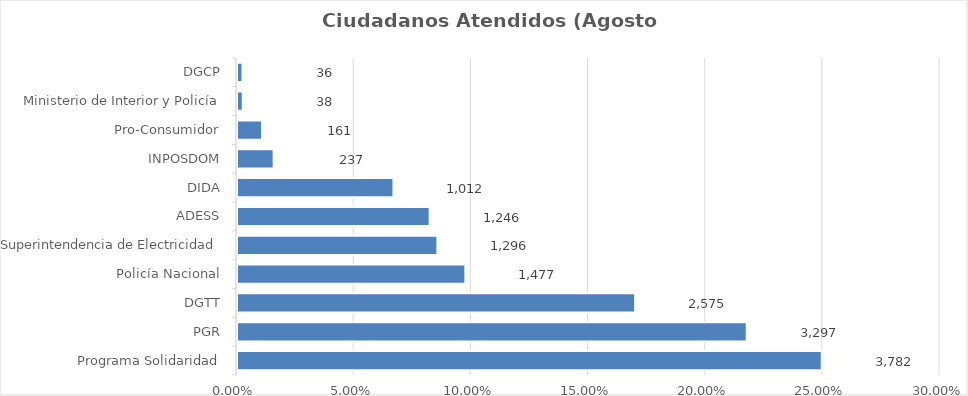
| Category | Porcentaje |
|---|---|
| Programa Solidaridad | 0.25 |
| PGR | 0.218 |
| DGTT | 0.17 |
| Policía Nacional | 0.097 |
| Superintendencia de Electricidad | 0.086 |
| ADESS | 0.082 |
| DIDA | 0.067 |
| INPOSDOM | 0.016 |
| Pro-Consumidor | 0.011 |
| Ministerio de Interior y Policía | 0.003 |
| DGCP | 0.002 |